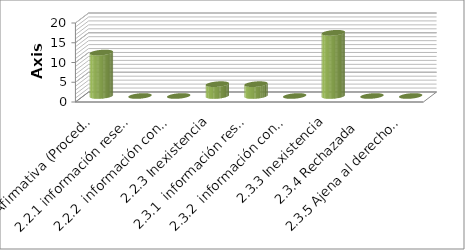
| Category | Series 0 |
|---|---|
| 2.1 Afirmativa (Procedente) | 11 |
| 2.2.1 información reservada | 0 |
| 2.2.2  información confidencial | 0 |
| 2.2.3 Inexistencia | 3 |
| 2.3.1  información reservada | 3 |
| 2.3.2  información confidencial | 0 |
| 2.3.3 Inexistencia | 16 |
| 2.3.4 Rechazada  | 0 |
| 2.3.5 Ajena al derecho de Inf. | 0 |